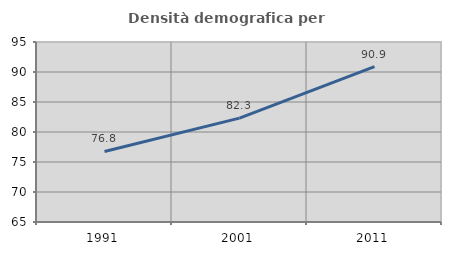
| Category | Densità demografica |
|---|---|
| 1991.0 | 76.756 |
| 2001.0 | 82.318 |
| 2011.0 | 90.909 |